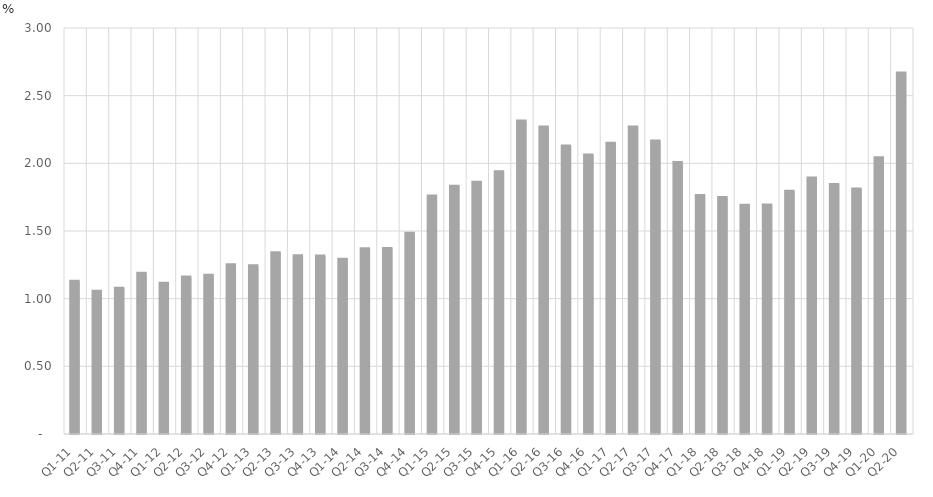
| Category | Percent of Total GDP |
|---|---|
| Q1-11 | 1.13 |
| Q2-11 | 1.054 |
| Q3-11 | 1.077 |
| Q4-11 | 1.187 |
| Q1-12 | 1.113 |
| Q2-12 | 1.16 |
| Q3-12 | 1.172 |
| Q4-12 | 1.25 |
| Q1-13 | 1.244 |
| Q2-13 | 1.34 |
| Q3-13 | 1.316 |
| Q4-13 | 1.314 |
| Q1-14 | 1.291 |
| Q2-14 | 1.369 |
| Q3-14 | 1.371 |
| Q4-14 | 1.483 |
| Q1-15 | 1.758 |
| Q2-15 | 1.831 |
| Q3-15 | 1.86 |
| Q4-15 | 1.938 |
| Q1-16 | 2.313 |
| Q2-16 | 2.269 |
| Q3-16 | 2.129 |
| Q4-16 | 2.062 |
| Q1-17 | 2.148 |
| Q2-17 | 2.269 |
| Q3-17 | 2.165 |
| Q4-17 | 2.006 |
| Q1-18 | 1.763 |
| Q2-18 | 1.748 |
| Q3-18 | 1.691 |
| Q4-18 | 1.693 |
| Q1-19 | 1.793 |
| Q2-19 | 1.891 |
| Q3-19 | 1.844 |
| Q4-19 | 1.809 |
| Q1-20 | 2.04 |
| Q2-20 | 2.668 |